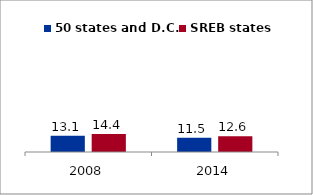
| Category | 50 states and D.C. | SREB states |
|---|---|---|
| 2008.0 | 13.139 | 14.437 |
| 2014.0 | 11.511 | 12.613 |